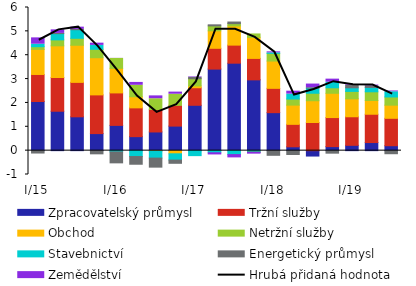
| Category | Zpracovatelský průmysl | Tržní služby | Obchod | Netržní služby  | Stavebnictví | Energetický průmysl | Zemědělství |
|---|---|---|---|---|---|---|---|
| I/15 | 2.06 | 1.133 | 1.052 | 0.112 | 0.104 | -0.1 | 0.266 |
| II | 1.652 | 1.414 | 1.328 | 0.249 | 0.262 | 0.009 | 0.149 |
| III | 1.418 | 1.443 | 1.556 | 0.292 | 0.36 | 0.012 | 0.096 |
| IV | 0.715 | 1.622 | 1.558 | 0.353 | 0.163 | -0.134 | 0.095 |
| I/16 | 1.059 | 1.361 | 1.03 | 0.415 | -0.053 | -0.459 | 0.003 |
| II | 0.587 | 1.207 | 0.466 | 0.48 | -0.247 | -0.323 | 0.12 |
| III | 0.783 | 0.942 | -0.02 | 0.451 | -0.292 | -0.379 | 0.119 |
| IV | 1.029 | 0.87 | -0.132 | 0.466 | -0.263 | -0.135 | 0.089 |
| I/17 | 1.901 | 0.736 | 0.075 | 0.302 | -0.209 | 0.056 | 0.021 |
| II | 3.418 | 0.872 | 0.733 | 0.207 | -0.09 | 0.044 | -0.091 |
| III | 3.666 | 0.757 | 0.806 | 0.095 | -0.166 | 0.068 | -0.138 |
| IV | 2.967 | 0.899 | 0.884 | 0.142 | -0.054 | -0.025 | -0.067 |
| I/18 | 1.592 | 1.019 | 1.144 | 0.322 | 0.02 | -0.195 | 0.043 |
| II | 0.161 | 0.941 | 0.806 | 0.255 | 0.206 | -0.163 | 0.123 |
| III | -0.227 | 1.179 | 0.912 | 0.314 | 0.218 | 0.014 | 0.154 |
| IV | 0.169 | 1.218 | 1.017 | 0.23 | 0.234 | -0.106 | 0.129 |
| I/19 | 0.223 | 1.197 | 0.753 | 0.31 | 0.152 | 0.099 | 0.029 |
| II | 0.34 | 1.186 | 0.577 | 0.364 | 0.183 | 0.065 | 0.033 |
| III | 0.207 | 1.149 | 0.552 | 0.343 | 0.218 | -0.129 | 0.034 |